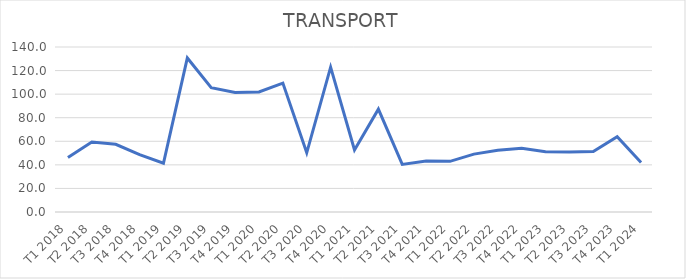
| Category | Series 0 |
|---|---|
| T1 2018 | 46.216 |
| T2 2018 | 59.428 |
| T3 2018 | 57.475 |
| T4 2018 | 48.6 |
| T1 2019 | 41.361 |
| T2 2019 | 130.691 |
| T3 2019 | 105.479 |
| T4 2019 | 101.458 |
| T1 2020 | 101.882 |
| T2 2020 | 109.358 |
| T3 2020 | 50.24 |
| T4 2020 | 122.914 |
| T1 2021 | 52.679 |
| T2 2021 | 87.238 |
| T3 2021 | 40.394 |
| T4 2021 | 43.235 |
| T1 2022 | 42.998 |
| T2 2022 | 49.092 |
| T3 2022 | 52.478 |
| T4 2022 | 54.086 |
| T1 2023 | 51.172 |
| T2 2023 | 50.843 |
| T3 2023 | 51.361 |
| T4 2023 | 63.809 |
| T1 2024 | 41.936 |